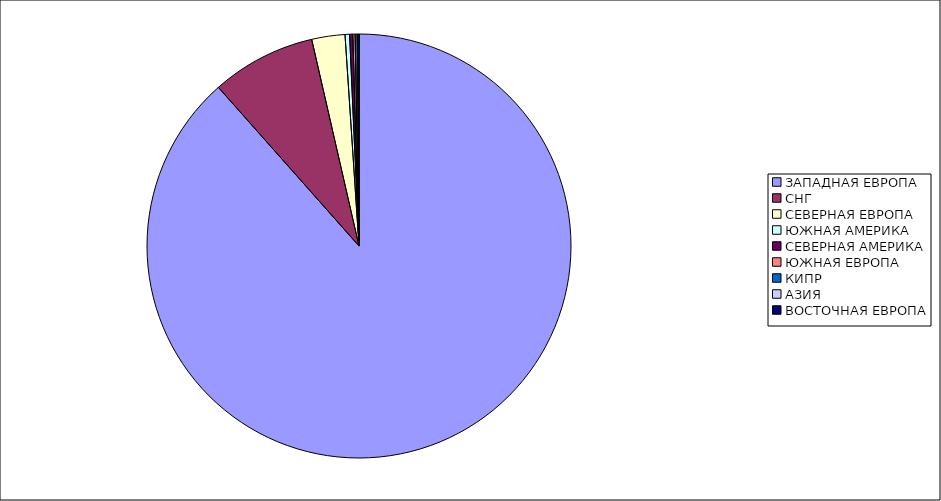
| Category | Оборот |
|---|---|
| ЗАПАДНАЯ ЕВРОПА | 0.885 |
| СНГ | 0.08 |
| СЕВЕРНАЯ ЕВРОПА | 0.025 |
| ЮЖНАЯ АМЕРИКА | 0.003 |
| СЕВЕРНАЯ АМЕРИКА | 0.002 |
| ЮЖНАЯ ЕВРОПА | 0.002 |
| КИПР | 0.002 |
| АЗИЯ | 0.001 |
| ВОСТОЧНАЯ ЕВРОПА | 0 |